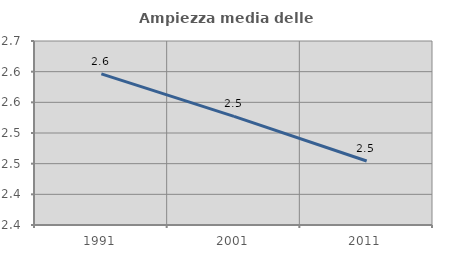
| Category | Ampiezza media delle famiglie |
|---|---|
| 1991.0 | 2.596 |
| 2001.0 | 2.527 |
| 2011.0 | 2.454 |